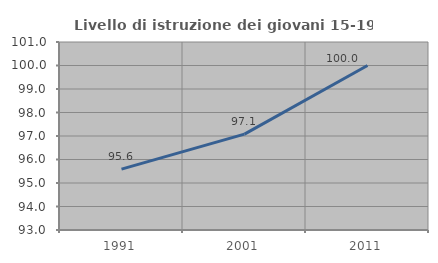
| Category | Livello di istruzione dei giovani 15-19 anni |
|---|---|
| 1991.0 | 95.588 |
| 2001.0 | 97.08 |
| 2011.0 | 100 |